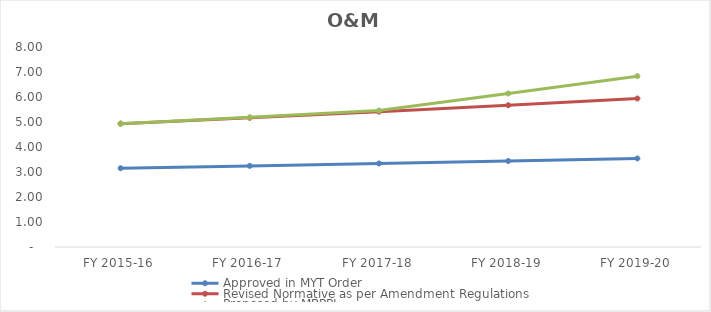
| Category | Approved in MYT Order | Revised Normative as per Amendment Regulations | Proposed by MBPPL |
|---|---|---|---|
| FY 2015-16 | 3.151 | 4.934 | 4.934 |
| FY 2016-17 | 3.245 | 5.168 | 5.187 |
| FY 2017-18 | 3.341 | 5.414 | 5.458 |
| FY 2018-19 | 3.441 | 5.671 | 6.141 |
| FY 2019-20 | 3.543 | 5.94 | 6.834 |